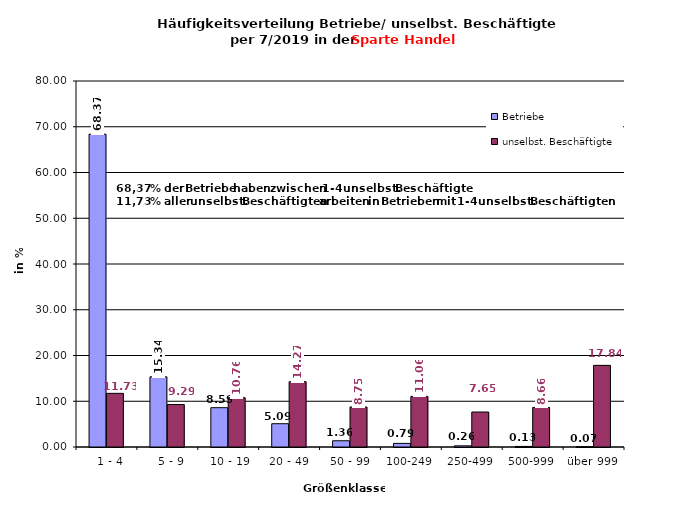
| Category | Betriebe | unselbst. Beschäftigte |
|---|---|---|
|   1 - 4 | 68.37 | 11.726 |
|   5 - 9 | 15.337 | 9.289 |
|  10 - 19 | 8.595 | 10.759 |
| 20 - 49 | 5.089 | 14.27 |
| 50 - 99 | 1.364 | 8.747 |
| 100-249 | 0.787 | 11.061 |
| 250-499 | 0.259 | 7.648 |
| 500-999 | 0.129 | 8.657 |
| über 999 | 0.07 | 17.844 |